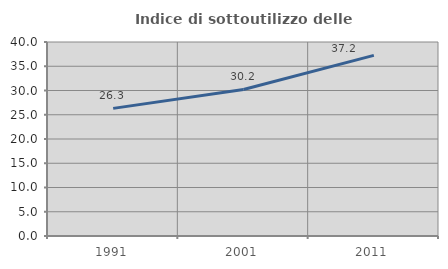
| Category | Indice di sottoutilizzo delle abitazioni  |
|---|---|
| 1991.0 | 26.314 |
| 2001.0 | 30.22 |
| 2011.0 | 37.247 |